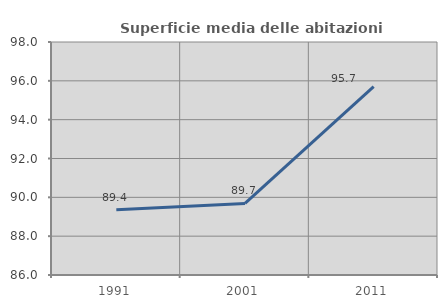
| Category | Superficie media delle abitazioni occupate |
|---|---|
| 1991.0 | 89.356 |
| 2001.0 | 89.686 |
| 2011.0 | 95.703 |